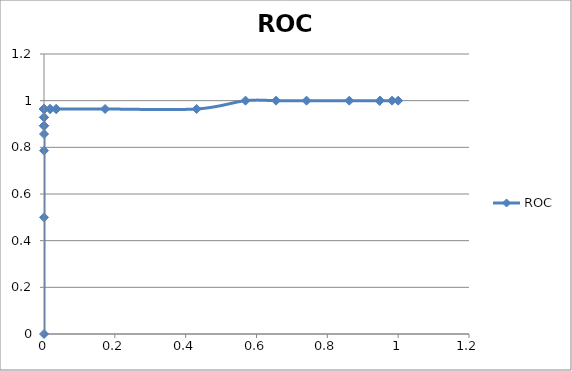
| Category | ROC |
|---|---|
| 0.0 | 0 |
| 0.0 | 0.5 |
| 0.0 | 0.786 |
| 0.0 | 0.857 |
| 0.0 | 0.893 |
| 0.0 | 0.893 |
| 0.0 | 0.893 |
| 0.0 | 0.893 |
| 0.0 | 0.893 |
| 0.0 | 0.929 |
| 0.0 | 0.929 |
| 0.0 | 0.964 |
| 0.0 | 0.964 |
| 0.0 | 0.964 |
| 0.0 | 0.964 |
| 0.0 | 0.964 |
| 0.0 | 0.964 |
| 0.0 | 0.964 |
| 0.0 | 0.964 |
| 0.0 | 0.964 |
| 0.0 | 0.964 |
| 0.0 | 0.964 |
| 0.0 | 0.964 |
| 0.0 | 0.964 |
| 0.0 | 0.964 |
| 0.0 | 0.964 |
| 0.017241379310344862 | 0.964 |
| 0.017241379310344862 | 0.964 |
| 0.03448275862068961 | 0.964 |
| 0.03448275862068961 | 0.964 |
| 0.1724137931034483 | 0.964 |
| 0.43103448275862066 | 0.964 |
| 0.5689655172413793 | 1 |
| 0.6551724137931034 | 1 |
| 0.7413793103448276 | 1 |
| 0.8620689655172413 | 1 |
| 0.9482758620689655 | 1 |
| 0.9482758620689655 | 1 |
| 0.9482758620689655 | 1 |
| 0.9482758620689655 | 1 |
| 0.9827586206896551 | 1 |
| 1.0 | 1 |